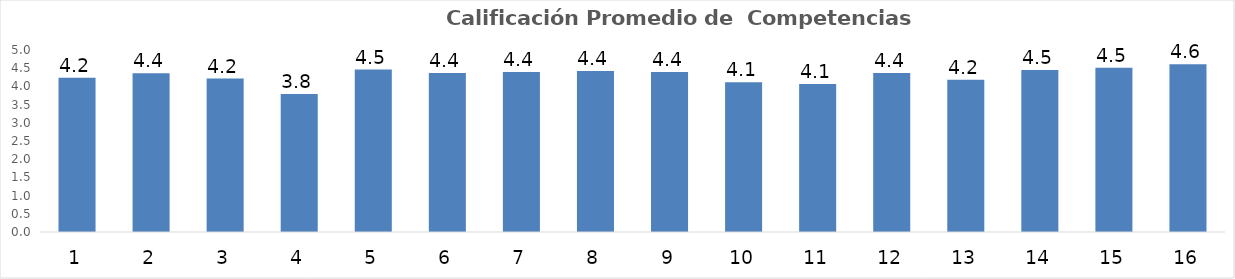
| Category | Series 0 |
|---|---|
| 0 | 4.239 |
| 1 | 4.363 |
| 2 | 4.216 |
| 3 | 3.788 |
| 4 | 4.463 |
| 5 | 4.369 |
| 6 | 4.396 |
| 7 | 4.426 |
| 8 | 4.398 |
| 9 | 4.115 |
| 10 | 4.067 |
| 11 | 4.365 |
| 12 | 4.18 |
| 13 | 4.451 |
| 14 | 4.509 |
| 15 | 4.61 |